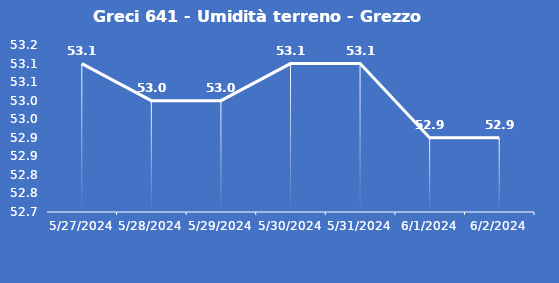
| Category | Greci 641 - Umidità terreno - Grezzo (%VWC) |
|---|---|
| 5/27/24 | 53.1 |
| 5/28/24 | 53 |
| 5/29/24 | 53 |
| 5/30/24 | 53.1 |
| 5/31/24 | 53.1 |
| 6/1/24 | 52.9 |
| 6/2/24 | 52.9 |